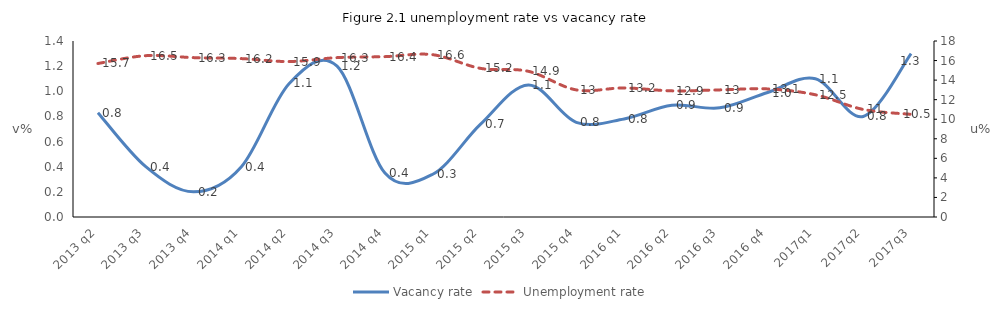
| Category | Vacancy rate |
|---|---|
| 2013 q2 | 0.83 |
| 2013 q3 | 0.4 |
| 2013 q4 | 0.2 |
| 2014 q1 | 0.4 |
| 2014 q2 | 1.062 |
| 2014 q3 | 1.2 |
| 2014 q4 | 0.35 |
| 2015 q1 | 0.34 |
| 2015 q2 | 0.738 |
| 2015 q3 | 1.051 |
| 2015 q4 | 0.753 |
| 2016 q1 | 0.78 |
| 2016 q2 | 0.889 |
| 2016 q3 | 0.868 |
| 2016 q4 | 0.99 |
| 2017q1 | 1.1 |
| 2017q2 | 0.8 |
| 2017q3 | 1.3 |